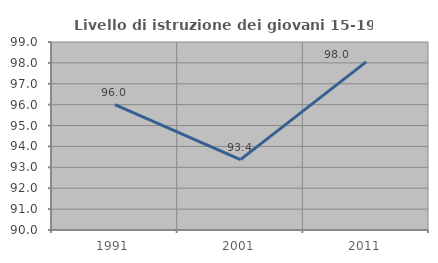
| Category | Livello di istruzione dei giovani 15-19 anni |
|---|---|
| 1991.0 | 96 |
| 2001.0 | 93.37 |
| 2011.0 | 98.049 |